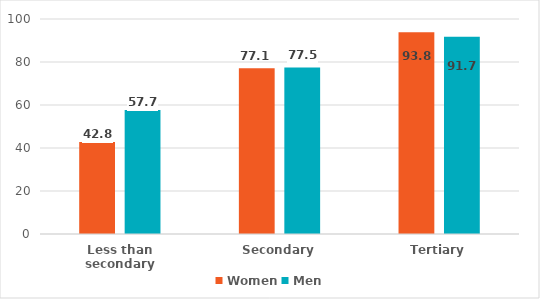
| Category | Women | Men |
|---|---|---|
| Less than secondary | 42.8 | 57.7 |
| Secondary | 77.1 | 77.5 |
| Tertiary | 93.8 | 91.7 |